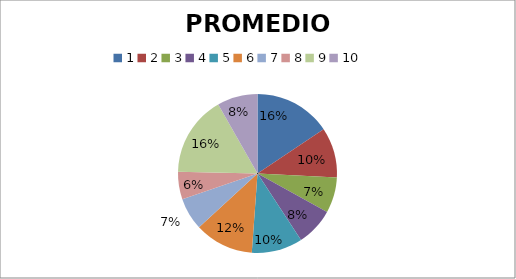
| Category | PROMEDIO  |
|---|---|
| 0 | 23.75 |
| 1 | 15.5 |
| 2 | 11 |
| 3 | 11.75 |
| 4 | 15.75 |
| 5 | 18.25 |
| 6 | 10 |
| 7 | 8.5 |
| 8 | 25 |
| 9 | 12.5 |